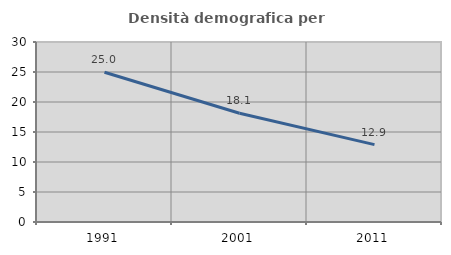
| Category | Densità demografica |
|---|---|
| 1991.0 | 24.953 |
| 2001.0 | 18.119 |
| 2011.0 | 12.89 |